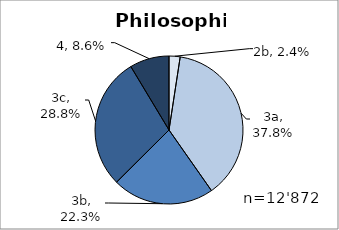
| Category | Philosophie |
|---|---|
| 2b | 0.024 |
| 3a | 0.378 |
| 3b | 0.223 |
| 3c | 0.288 |
| 4 | 0.086 |